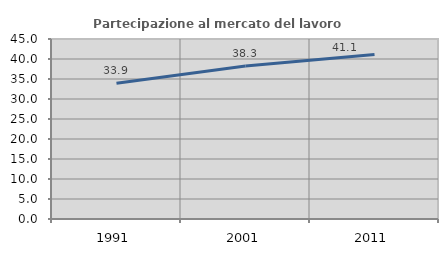
| Category | Partecipazione al mercato del lavoro  femminile |
|---|---|
| 1991.0 | 33.941 |
| 2001.0 | 38.26 |
| 2011.0 | 41.13 |